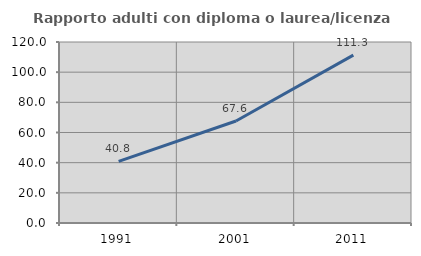
| Category | Rapporto adulti con diploma o laurea/licenza media  |
|---|---|
| 1991.0 | 40.816 |
| 2001.0 | 67.606 |
| 2011.0 | 111.29 |